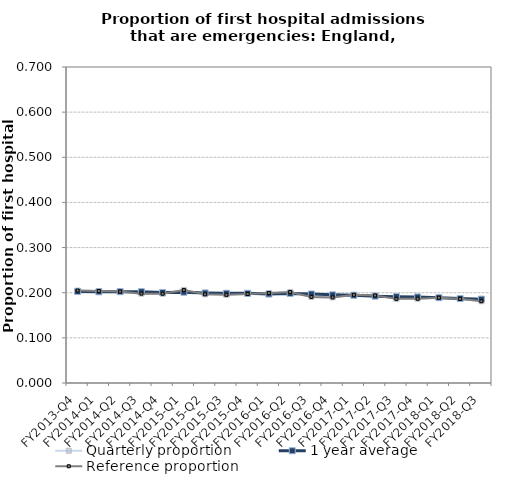
| Category | Quarterly proportion | 1 year average | Reference proportion |
|---|---|---|---|
| FY2013-Q4 | 0.205 | 0.203 | 0.205 |
| FY2014-Q1 | 0.204 | 0.202 | 0.204 |
| FY2014-Q2 | 0.203 | 0.202 | 0.203 |
| FY2014-Q3 | 0.198 | 0.202 | 0.198 |
| FY2014-Q4 | 0.198 | 0.201 | 0.198 |
| FY2015-Q1 | 0.206 | 0.201 | 0.206 |
| FY2015-Q2 | 0.196 | 0.2 | 0.196 |
| FY2015-Q3 | 0.195 | 0.199 | 0.195 |
| FY2015-Q4 | 0.197 | 0.199 | 0.197 |
| FY2016-Q1 | 0.199 | 0.197 | 0.199 |
| FY2016-Q2 | 0.201 | 0.198 | 0.201 |
| FY2016-Q3 | 0.191 | 0.197 | 0.191 |
| FY2016-Q4 | 0.19 | 0.195 | 0.19 |
| FY2017-Q1 | 0.195 | 0.194 | 0.195 |
| FY2017-Q2 | 0.194 | 0.192 | 0.194 |
| FY2017-Q3 | 0.186 | 0.191 | 0.186 |
| FY2017-Q4 | 0.187 | 0.191 | 0.187 |
| FY2018-Q1 | 0.189 | 0.189 | 0.189 |
| FY2018-Q2 | 0.186 | 0.187 | 0.186 |
| FY2018-Q3 | 0.181 | 0.186 | 0.181 |